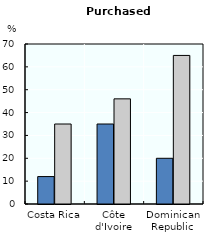
| Category | Immigrants without regular migration status | Immigrants with regular migration status |
|---|---|---|
| Costa Rica | 12 | 35 |
| Côte d'Ivoire | 35 | 46 |
| Dominican Republic | 20 | 65 |